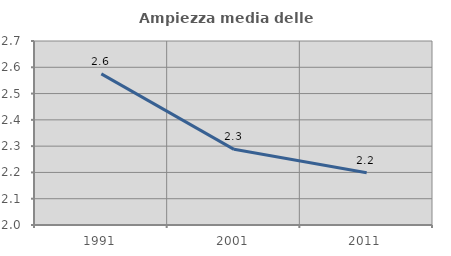
| Category | Ampiezza media delle famiglie |
|---|---|
| 1991.0 | 2.575 |
| 2001.0 | 2.288 |
| 2011.0 | 2.199 |